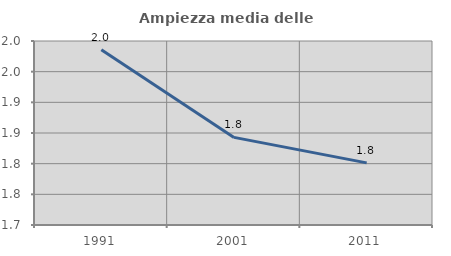
| Category | Ampiezza media delle famiglie |
|---|---|
| 1991.0 | 1.986 |
| 2001.0 | 1.843 |
| 2011.0 | 1.801 |